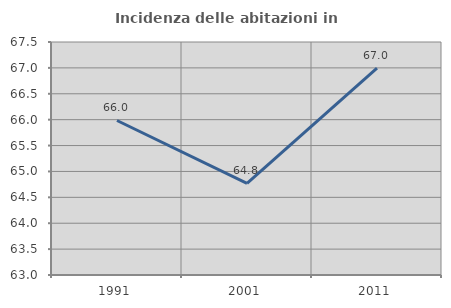
| Category | Incidenza delle abitazioni in proprietà  |
|---|---|
| 1991.0 | 65.984 |
| 2001.0 | 64.771 |
| 2011.0 | 66.993 |